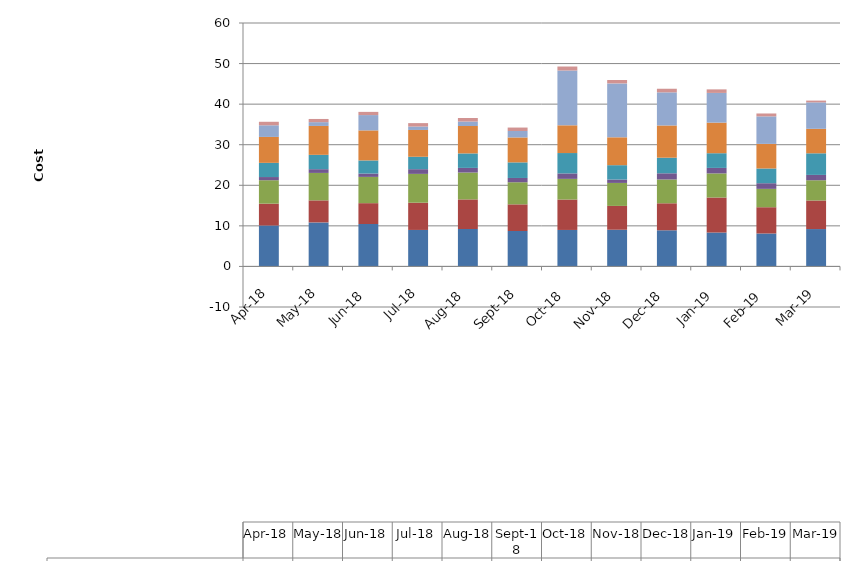
| Category | AS - Response | AS - Fast Reserves | AS - STOR | AS - Other Reserves | AS - Black Start | AS - Reactive | AS - Constraints  | AS - SO-SO Costs | AS - Other Ancillary Cost | AS - Outstanding Liabilities |
|---|---|---|---|---|---|---|---|---|---|---|
| 2018-04-01 | 10.088 | 5.384 | 5.773 | 0.787 | 3.497 | 6.39 | 2.865 | 0.867 | 0.001 | 0.005 |
| 2018-05-01 | 10.848 | 5.437 | 6.763 | 0.92 | 3.538 | 7.121 | 0.934 | 0.786 | 0.001 | 0.005 |
| 2018-06-01 | 10.452 | 5.142 | 6.474 | 0.826 | 3.232 | 7.407 | 3.77 | 0.789 | 0 | 0.005 |
| 2018-07-01 | 8.994 | 6.713 | 7.101 | 1.159 | 3.061 | 6.606 | 0.842 | 0.846 | 0 | 0.005 |
| 2018-08-01 | 9.231 | 7.289 | 6.621 | 1.145 | 3.569 | 6.756 | 1.1 | 0.875 | 0 | 0.005 |
| 2018-09-01 | 8.735 | 6.567 | 5.446 | 1.055 | 3.842 | 6.149 | 1.584 | 0.851 | 0 | 0.005 |
| 2018-10-01 | 8.991 | 7.498 | 5.093 | 1.345 | 5.02 | 6.836 | 13.508 | 0.983 | 0 | 0.005 |
| 2018-11-01 | 9.045 | 5.87 | 5.668 | 0.836 | 3.537 | 6.867 | 13.287 | 0.836 | 0 | 0.005 |
| 2018-12-01 | 8.908 | 6.656 | 5.873 | 1.518 | 3.846 | 7.944 | 8.159 | 0.891 | 0.001 | 0.005 |
| 2019-01-01 | 8.355 | 8.63 | 5.94 | 1.36 | 3.618 | 7.546 | 7.32 | 0.87 | 0 | 0.005 |
| 2019-02-01 | 8.116 | 6.477 | 4.527 | 1.389 | 3.629 | 6.067 | 6.777 | 0.716 | 0 | 0.005 |
| 2019-03-01 | 9.211 | 7.043 | 4.984 | 1.32 | 5.323 | 6.036 | 6.518 | 0.441 | 0 | 0.005 |